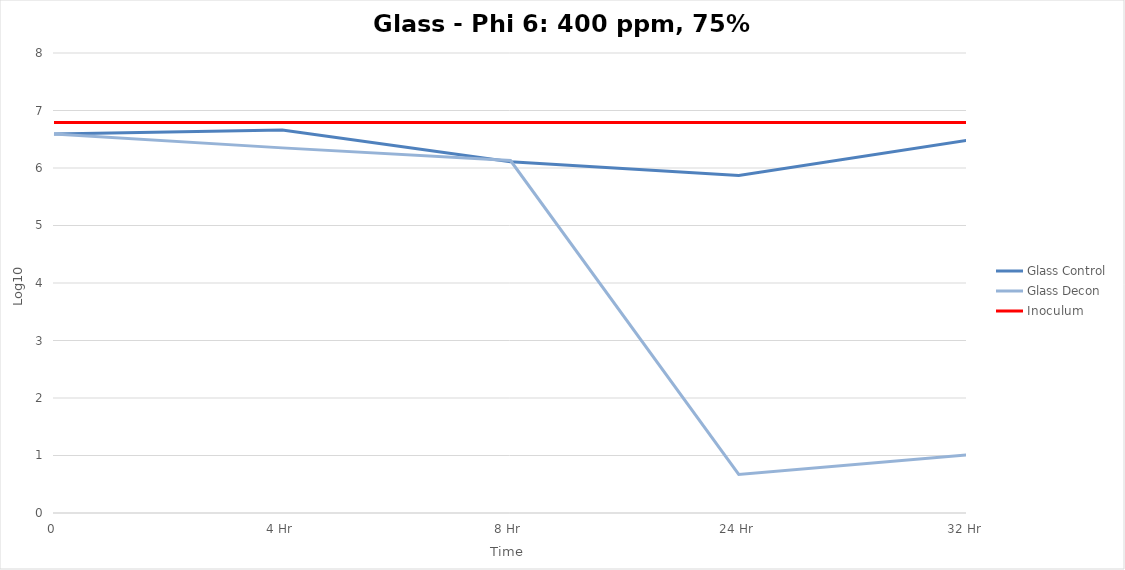
| Category | Glass Control | Glass Decon | Inoculum |
|---|---|---|---|
| 0 | 6.59 | 6.59 | 6.79 |
| 4 Hr | 6.66 | 6.35 | 6.79 |
| 8 Hr | 6.11 | 6.13 | 6.79 |
| 24 Hr | 5.87 | 0.67 | 6.79 |
| 32 Hr | 6.48 | 1.01 | 6.79 |